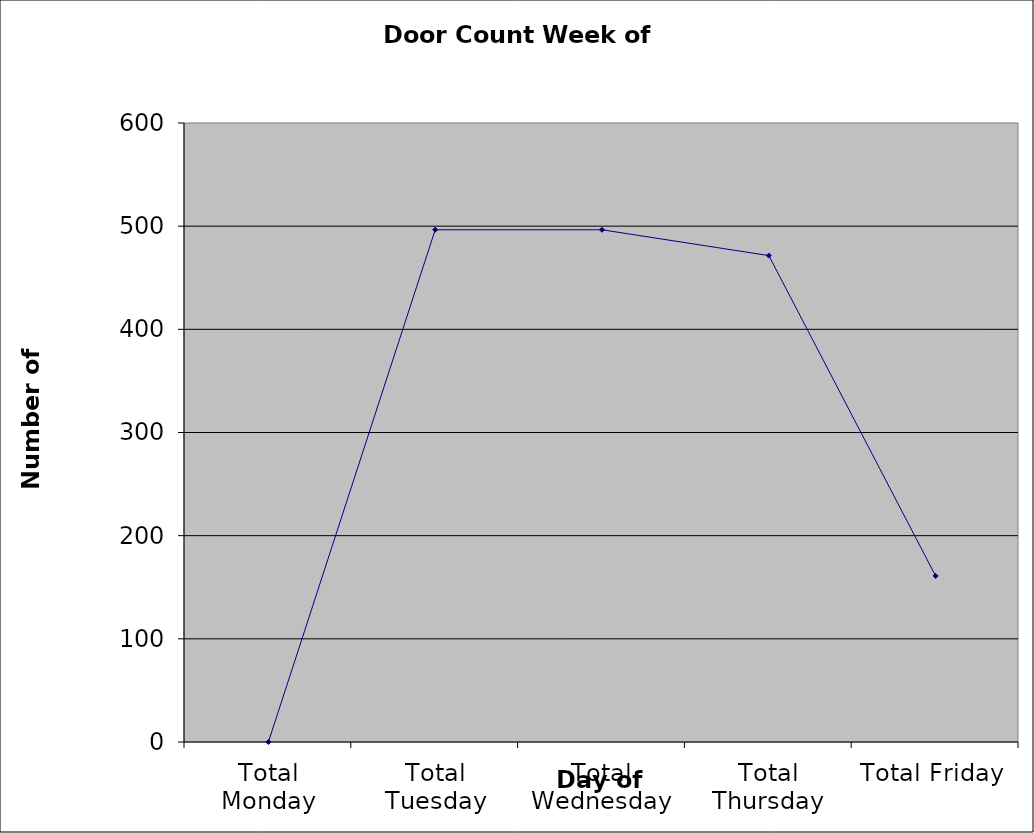
| Category | Series 0 |
|---|---|
| Total Monday | 0 |
| Total Tuesday | 496.5 |
| Total Wednesday | 496.5 |
| Total Thursday | 471.5 |
| Total Friday | 161 |